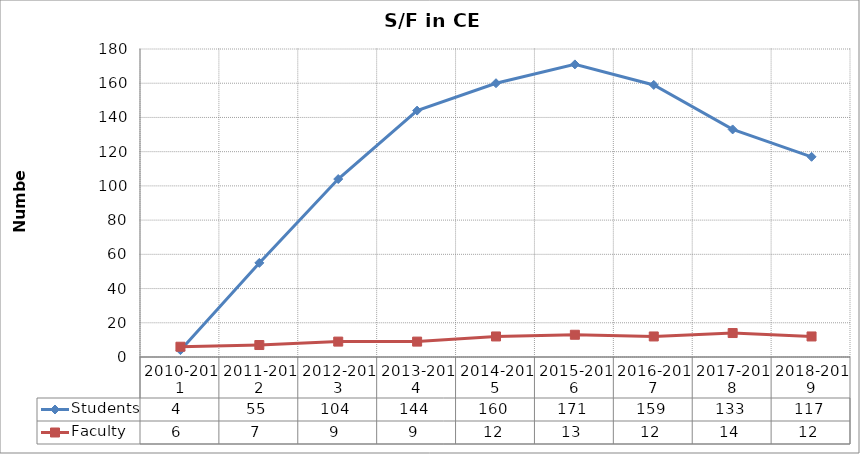
| Category | Students | Faculty |
|---|---|---|
| 2010-2011 | 4 | 6 |
| 2011-2012 | 55 | 7 |
| 2012-2013 | 104 | 9 |
| 2013-2014 | 144 | 9 |
| 2014-2015 | 160 | 12 |
| 2015-2016 | 171 | 13 |
| 2016-2017 | 159 | 12 |
| 2017-2018 | 133 | 14 |
| 2018-2019 | 117 | 12 |